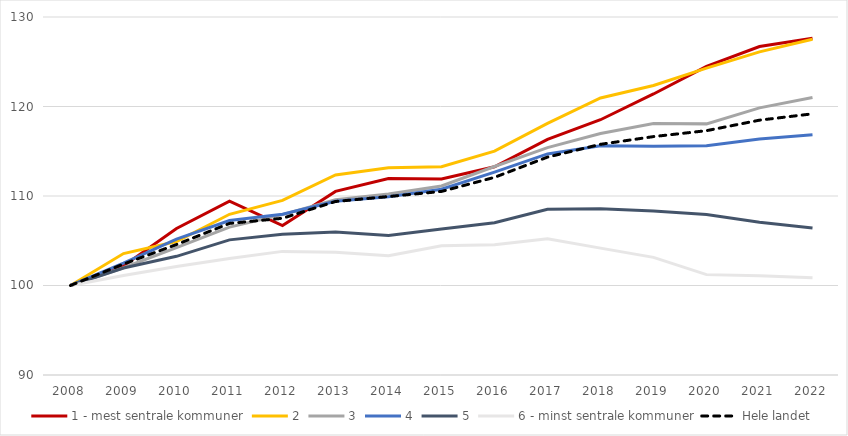
| Category | 1 - mest sentrale kommuner | 2 | 3 | 4 | 5 | 6 - minst sentrale kommuner | Hele landet |
|---|---|---|---|---|---|---|---|
| 2008.0 | 100 | 100 | 100 | 100 | 100 | 100 | 100 |
| 2009.0 | 102.193 | 103.569 | 101.987 | 102.513 | 101.949 | 101.119 | 102.395 |
| 2010.0 | 106.371 | 104.918 | 104.23 | 105.186 | 103.258 | 102.133 | 104.578 |
| 2011.0 | 109.427 | 107.957 | 106.519 | 107.26 | 105.098 | 103.013 | 106.936 |
| 2012.0 | 106.689 | 109.508 | 107.916 | 107.952 | 105.714 | 103.813 | 107.512 |
| 2013.0 | 110.517 | 112.354 | 109.582 | 109.406 | 105.97 | 103.714 | 109.385 |
| 2014.0 | 111.962 | 113.16 | 110.217 | 109.92 | 105.575 | 103.324 | 109.938 |
| 2015.0 | 111.913 | 113.27 | 111.117 | 110.755 | 106.311 | 104.429 | 110.511 |
| 2016.0 | 113.265 | 115.018 | 113.294 | 112.669 | 107.004 | 104.562 | 112.084 |
| 2017.0 | 116.33 | 118.107 | 115.412 | 114.699 | 108.522 | 105.213 | 114.345 |
| 2018.0 | 118.52 | 120.952 | 116.991 | 115.623 | 108.584 | 104.176 | 115.775 |
| 2019.0 | 121.4 | 122.352 | 118.096 | 115.568 | 108.322 | 103.141 | 116.638 |
| 2020.0 | 124.477 | 124.286 | 118.059 | 115.612 | 107.922 | 101.215 | 117.3 |
| 2021.0 | 126.706 | 126.101 | 119.846 | 116.37 | 107.061 | 101.093 | 118.473 |
| 2022.0 | 127.627 | 127.506 | 120.997 | 116.833 | 106.412 | 100.878 | 119.182 |